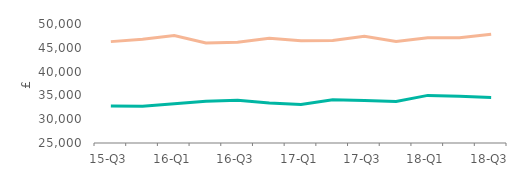
| Category | First-time
buyers | Home movers |
|---|---|---|
| 15-Q3 | 32772 | 46297.5 |
| 15-Q4 | 32725 | 46818 |
| 16-Q1 | 33235 | 47600 |
| 16-Q2 | 33794 | 45992 |
| 16-Q3 | 34000 | 46143 |
| 16-Q4 | 33398 | 47000 |
| 17-Q1 | 33068 | 46500 |
| 17-Q2 | 34096 | 46545 |
| 17-Q3 | 33921.5 | 47415 |
| 17-Q4 | 33708.5 | 46315 |
| 18-Q1 | 35000 | 47095 |
| 18-Q2 | 34802 | 47110.5 |
| 18-Q3 | 34566 | 47839.5 |